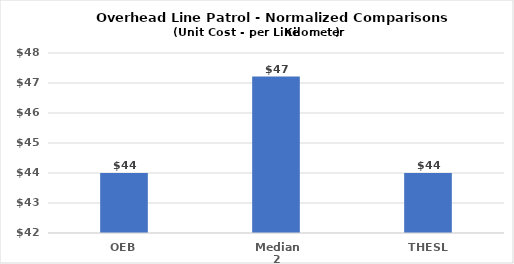
| Category | Series 0 |
|---|---|
| OEB | 44 |
| Median 2 | 47.215 |
| THESL | 44 |